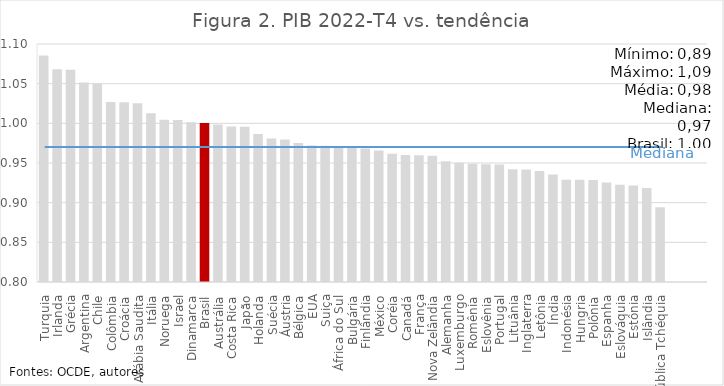
| Category | Q4-2022 |
|---|---|
| Turquia | 1.085 |
| Irlanda | 1.068 |
| Grécia | 1.068 |
| Argentina | 1.052 |
| Chile | 1.05 |
| Colômbia | 1.027 |
| Croácia | 1.026 |
| Arábia Saudita | 1.025 |
| Itália | 1.013 |
| Noruega | 1.005 |
| Israel | 1.004 |
| Dinamarca | 1.001 |
| Brasil | 1 |
| Austrália | 0.998 |
| Costa Rica | 0.996 |
| Japão | 0.996 |
| Holanda | 0.986 |
| Suécia | 0.981 |
| Áustria | 0.98 |
| Bélgica | 0.975 |
| EUA | 0.972 |
| Suiça | 0.972 |
| África do Sul | 0.971 |
| Bulgária | 0.969 |
| Finlândia | 0.968 |
| México | 0.966 |
| Coréia | 0.962 |
| Canadá | 0.96 |
| França | 0.96 |
| Nova Zelândia | 0.959 |
| Alemanha | 0.952 |
| Luxemburgo | 0.95 |
| Romênia | 0.949 |
| Eslovênia | 0.948 |
| Portugal | 0.948 |
| Lituânia | 0.942 |
| Inglaterra | 0.942 |
| Letônia | 0.94 |
| Índia | 0.936 |
| Indonésia | 0.929 |
| Hungria | 0.929 |
| Polônia | 0.929 |
| Espanha | 0.926 |
| Eslováquia | 0.923 |
| Estônia | 0.922 |
| Islândia | 0.919 |
| República Tchéquia | 0.894 |